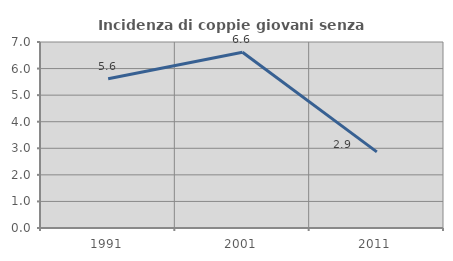
| Category | Incidenza di coppie giovani senza figli |
|---|---|
| 1991.0 | 5.618 |
| 2001.0 | 6.616 |
| 2011.0 | 2.865 |